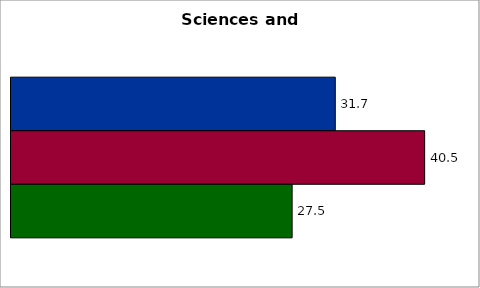
| Category | 50 states and D.C. | SREB states | Series 2 |
|---|---|---|---|
| 0 | 31.723 | 40.465 | 27.502 |